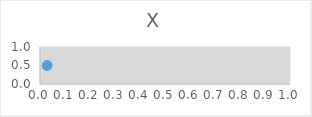
| Category | Series 0 |
|---|---|
| 0.028522664956597388 | 0.5 |